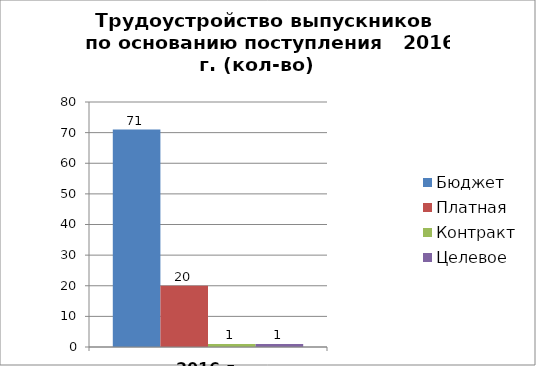
| Category | Бюджет | Платная | Контракт | Целевое |
|---|---|---|---|---|
| 2016 г. | 71 | 20 | 1 | 1 |